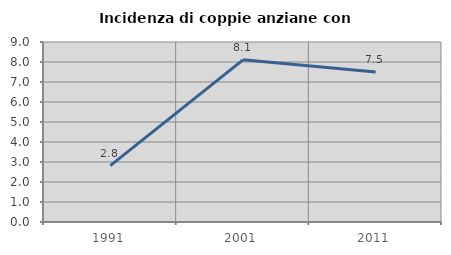
| Category | Incidenza di coppie anziane con figli |
|---|---|
| 1991.0 | 2.817 |
| 2001.0 | 8.108 |
| 2011.0 | 7.5 |